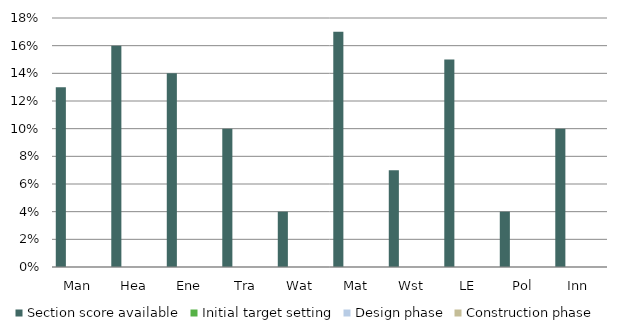
| Category | Section score available | Initial target setting | Design phase | Construction phase |
|---|---|---|---|---|
| Man | 0.13 | 0 | 0 | 0 |
| Hea | 0.16 | 0 | 0 | 0 |
| Ene | 0.14 | 0 | 0 | 0 |
| Tra | 0.1 | 0 | 0 | 0 |
| Wat | 0.04 | 0 | 0 | 0 |
| Mat | 0.17 | 0 | 0 | 0 |
| Wst | 0.07 | 0 | 0 | 0 |
| LE | 0.15 | 0 | 0 | 0 |
| Pol | 0.04 | 0 | 0 | 0 |
| Inn | 0.1 | 0 | 0 | 0 |